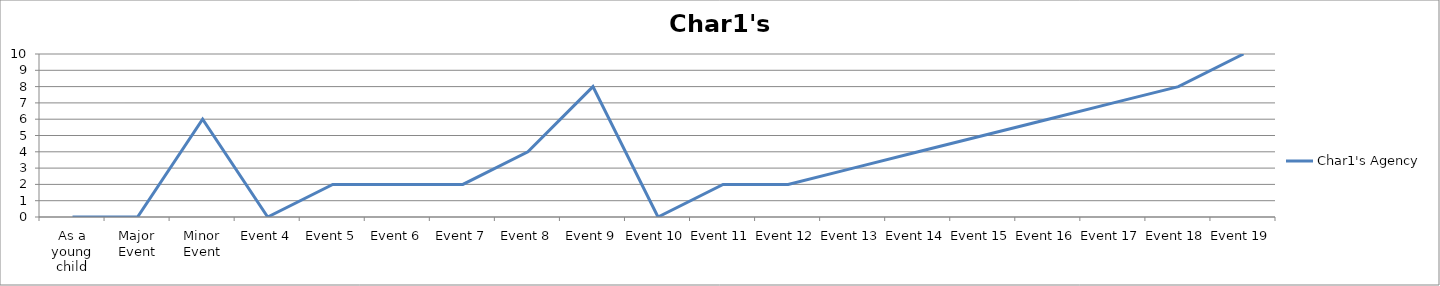
| Category | Char1's Agency |
|---|---|
| As a young child | 0 |
| Major Event | 0 |
| Minor Event | 6 |
| Event 4 | 0 |
| Event 5 | 2 |
| Event 6 | 2 |
| Event 7 | 2 |
| Event 8 | 4 |
| Event 9 | 8 |
| Event 10 | 0 |
| Event 11 | 2 |
| Event 12 | 2 |
| Event 13 | 3 |
| Event 14 | 4 |
| Event 15 | 5 |
| Event 16 | 6 |
| Event 17 | 7 |
| Event 18 | 8 |
| Event 19 | 10 |